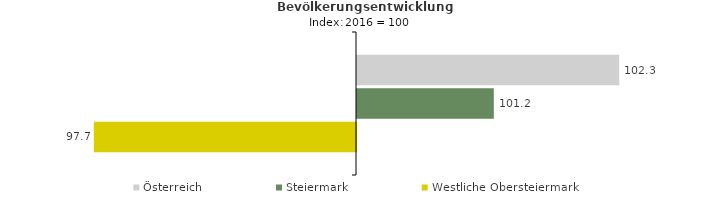
| Category | Österreich | Steiermark | Westliche Obersteiermark |
|---|---|---|---|
| 2020.0 | 102.3 | 101.2 | 97.7 |